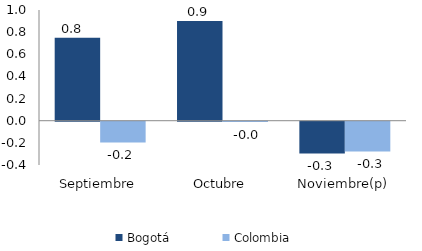
| Category | Bogotá | Colombia |
|---|---|---|
| Septiembre | 0.75 | -0.187 |
| Octubre | 0.9 | -0.002 |
| Noviembre(p) | -0.286 | -0.268 |